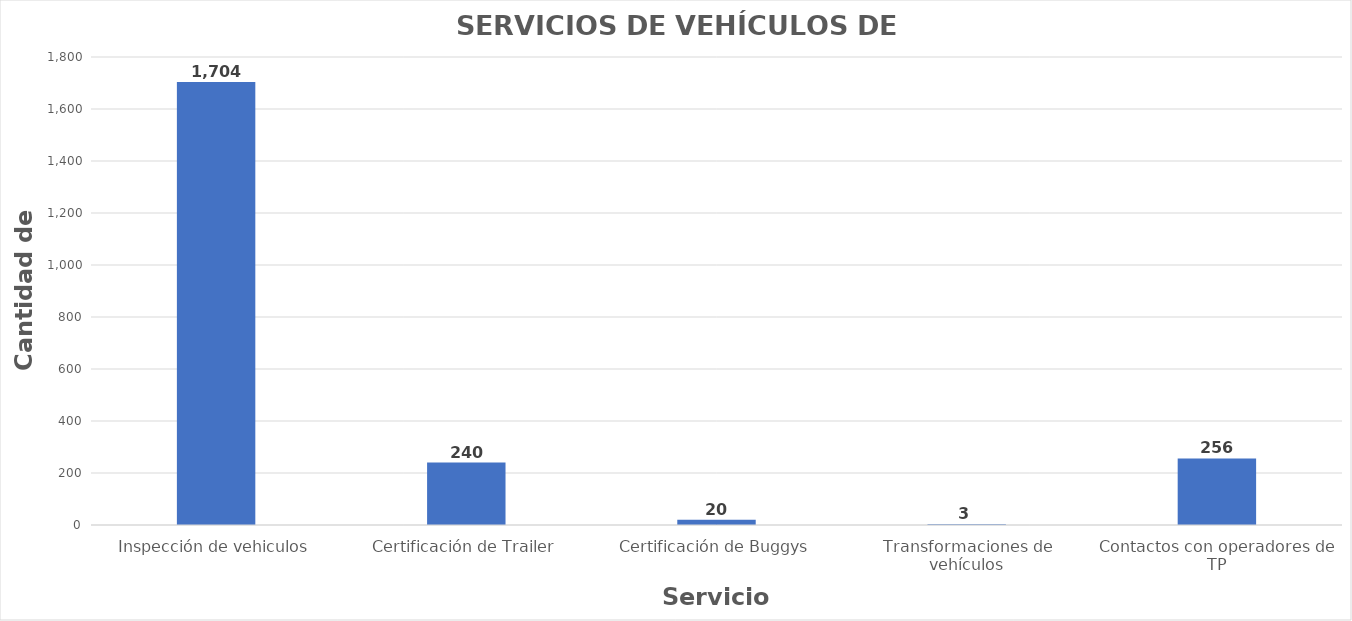
| Category | Series 0 |
|---|---|
| Inspección de vehiculos | 1704 |
| Certificación de Trailer | 240 |
| Certificación de Buggys | 20 |
| Transformaciones de vehículos | 3 |
| Contactos con operadores de TP | 256 |